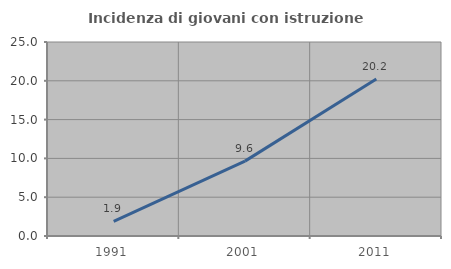
| Category | Incidenza di giovani con istruzione universitaria |
|---|---|
| 1991.0 | 1.898 |
| 2001.0 | 9.647 |
| 2011.0 | 20.228 |